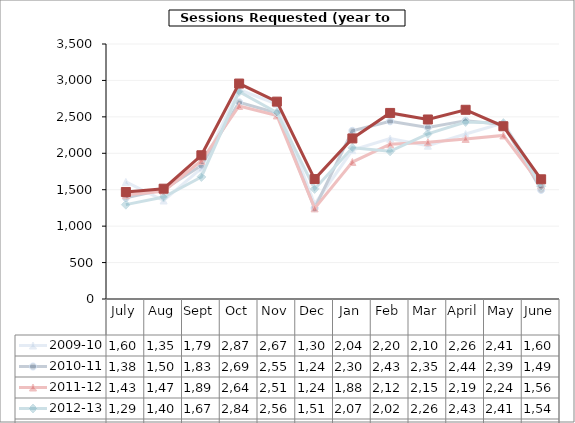
| Category | 2009-10 | 2010-11 | 2011-12 | 2012-13 | 2013-14 |
|---|---|---|---|---|---|
| July | 1607 | 1388 | 1430 | 1295 | 1469 |
| Aug | 1352 | 1502 | 1479 | 1400 | 1514 |
| Sept | 1794 | 1832 | 1897 | 1675 | 1973 |
| Oct | 2872 | 2699 | 2649 | 2846 | 2957 |
| Nov | 2676 | 2553 | 2519 | 2560 | 2709 |
| Dec | 1301 | 1246 | 1244 | 1511 | 1646 |
| Jan | 2043 | 2308 | 1880 | 2075 | 2204 |
| Feb | 2201 | 2439 | 2124 | 2027 | 2554 |
| Mar | 2104 | 2354 | 2152 | 2267 | 2464 |
| April | 2264 | 2448 | 2197 | 2430 | 2597 |
| May | 2415 | 2396 | 2245 | 2414 | 2371 |
| June | 1608 | 1498 | 1561 | 1548 | 1643 |